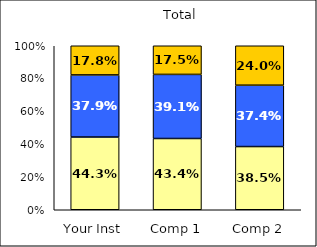
| Category | Low Civic Engagement | Average Civic Engagement | High Civic Engagement |
|---|---|---|---|
| Your Inst | 0.443 | 0.379 | 0.178 |
| Comp 1 | 0.434 | 0.391 | 0.175 |
| Comp 2 | 0.385 | 0.374 | 0.24 |